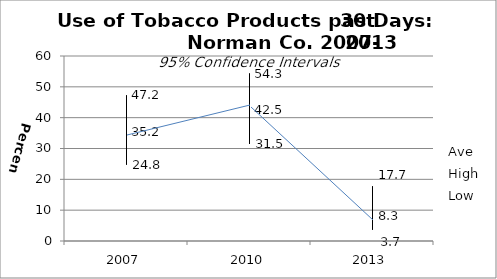
| Category | Ave | High | Low |
|---|---|---|---|
| 2007.0 | 35.2 | 47.2 | 24.8 |
| 2010.0 | 42.5 | 54.3 | 31.5 |
| 2013.0 | 8.3 | 17.7 | 3.7 |